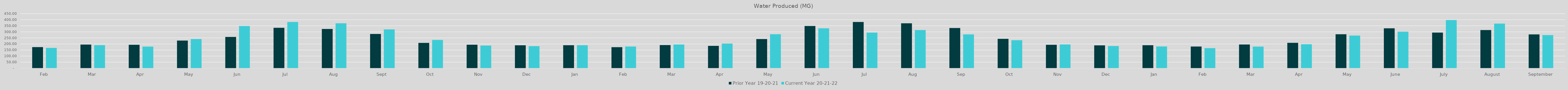
| Category | Prior Year 19-20-21 | Current Year 20-21-22 |
|---|---|---|
| Feb | 173.847 | 167.532 |
| Mar | 195.333 | 190.306 |
| Apr | 193.551 | 178.22 |
| May | 228.091 | 240.625 |
| Jun | 257.9 | 348.57 |
| Jul | 333.37 | 381.34 |
| Aug | 323.49 | 370.12 |
| Sep | 282.53 | 320.39 |
| Oct | 208.72 | 233.34 |
| Nov | 193.92 | 187.14 |
| Dec | 188.86 | 182.02 |
| Jan | 189.94 | 189.96 |
| Feb | 173.75 | 178.97 |
| Mar | 190.77 | 195.96 |
| Apr | 184.23 | 203.05 |
| May | 240.63 | 280.19 |
| Jun | 348.57 | 329.038 |
| Jul | 381.336 | 293.585 |
| Aug | 370.12 | 314.51 |
| Sep | 331.274 | 279.105 |
| Oct | 242.62 | 230.88 |
| Nov | 193.57 | 196.185 |
| Dec | 188.584 | 182.826 |
| Jan | 189.967 | 179.43 |
| Feb | 178.97 | 165.72 |
| Mar | 195.963 | 178.569 |
| Apr | 209.272 | 197.981 |
| May | 280.192 | 268.985 |
| June | 329.04 | 300.92 |
| July | 293.59 | 397.41 |
| August | 314.51 | 368.297 |
| September | 279.11 | 273.496 |